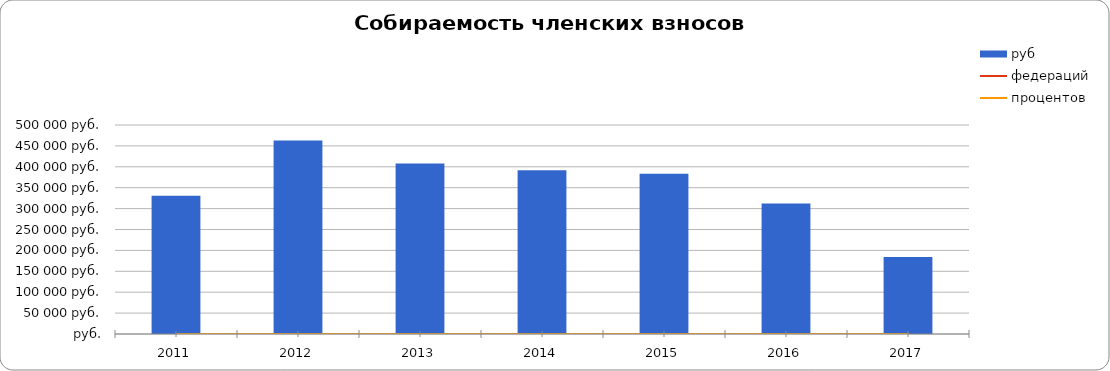
| Category | руб |
|---|---|
| 2011.0 | 331000 |
| 2012.0 | 463000 |
| 2013.0 | 408000 |
| 2014.0 | 392000 |
| 2015.0 | 383500 |
| 2016.0 | 312000 |
| 2017.0 | 184100 |